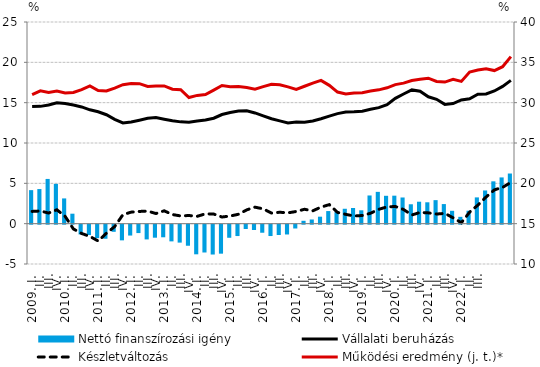
| Category | Nettó finanszírozási igény |
|---|---|
| 2009. I. | 4.156 |
|          II. | 4.29 |
|          III. | 5.545 |
|          IV. | 4.935 |
| 2010. I. | 3.13 |
|          II. | 1.236 |
|          III. | -1.214 |
|          IV. | -1.287 |
| 2011. I. | -1.668 |
|          II. | -1.744 |
|          III. | -0.885 |
|          IV. | -1.945 |
| 2012. I. | -1.349 |
|          II. | -1.042 |
|          III. | -1.828 |
|          IV. | -1.616 |
| 2013. I. | -1.564 |
| II. | -2.071 |
|          III. | -2.225 |
| IV. | -2.613 |
| 2014. I. | -3.675 |
| II. | -3.449 |
|          III. | -3.702 |
| IV. | -3.595 |
| 2015. I. | -1.624 |
| II. | -1.411 |
|          III. | -0.536 |
| IV. | -0.663 |
| 2016. I. | -1 |
| II. | -1.41 |
|          III. | -1.283 |
| IV. | -1.215 |
| 2017. I. | -0.473 |
| II. | 0.357 |
|          III. | 0.519 |
| IV. | 0.866 |
| 2018. I. | 1.562 |
| II. | 1.435 |
|          III. | 1.848 |
| IV. | 1.94 |
| 2019. I. | 1.657 |
| II. | 3.495 |
|          III. | 3.943 |
| IV. | 3.455 |
| 2020. I. | 3.47 |
| II. | 3.246 |
|          III. | 2.404 |
| IV. | 2.722 |
| 2021. I. | 2.65 |
| II. | 2.917 |
|          III. | 2.429 |
| IV. | 1.594 |
| 2022. I. | 0.847 |
| II. | 1.605 |
|          III. | 3.257 |